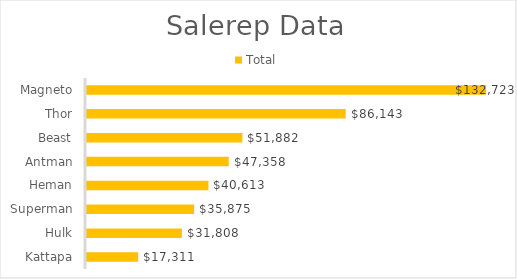
| Category | Total |
|---|---|
| Magneto | 132722.99 |
| Thor | 86142.63 |
| Beast | 51882.13 |
| Antman | 47357.71 |
| Heman | 40613.15 |
| Superman | 35875.48 |
| Hulk | 31807.95 |
| Kattapa | 17311.03 |